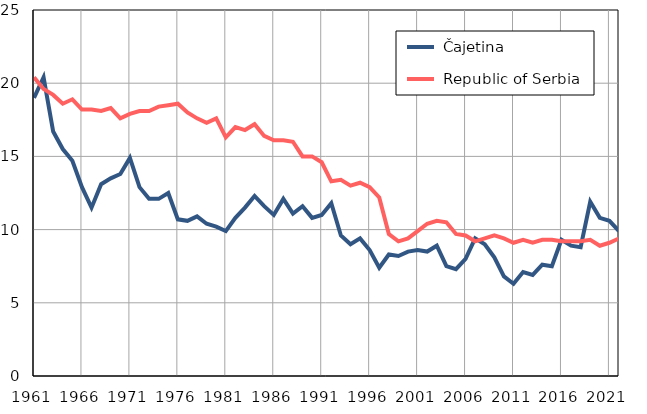
| Category |  Čajetina |  Republic of Serbia |
|---|---|---|
| 1961.0 | 19 | 20.4 |
| 1962.0 | 20.4 | 19.6 |
| 1963.0 | 16.7 | 19.2 |
| 1964.0 | 15.5 | 18.6 |
| 1965.0 | 14.7 | 18.9 |
| 1966.0 | 12.9 | 18.2 |
| 1967.0 | 11.5 | 18.2 |
| 1968.0 | 13.1 | 18.1 |
| 1969.0 | 13.5 | 18.3 |
| 1970.0 | 13.8 | 17.6 |
| 1971.0 | 14.9 | 17.9 |
| 1972.0 | 12.9 | 18.1 |
| 1973.0 | 12.1 | 18.1 |
| 1974.0 | 12.1 | 18.4 |
| 1975.0 | 12.5 | 18.5 |
| 1976.0 | 10.7 | 18.6 |
| 1977.0 | 10.6 | 18 |
| 1978.0 | 10.9 | 17.6 |
| 1979.0 | 10.4 | 17.3 |
| 1980.0 | 10.2 | 17.6 |
| 1981.0 | 9.9 | 16.3 |
| 1982.0 | 10.8 | 17 |
| 1983.0 | 11.5 | 16.8 |
| 1984.0 | 12.3 | 17.2 |
| 1985.0 | 11.6 | 16.4 |
| 1986.0 | 11 | 16.1 |
| 1987.0 | 12.1 | 16.1 |
| 1988.0 | 11.1 | 16 |
| 1989.0 | 11.6 | 15 |
| 1990.0 | 10.8 | 15 |
| 1991.0 | 11 | 14.6 |
| 1992.0 | 11.8 | 13.3 |
| 1993.0 | 9.6 | 13.4 |
| 1994.0 | 9 | 13 |
| 1995.0 | 9.4 | 13.2 |
| 1996.0 | 8.6 | 12.9 |
| 1997.0 | 7.4 | 12.2 |
| 1998.0 | 8.3 | 9.7 |
| 1999.0 | 8.2 | 9.2 |
| 2000.0 | 8.5 | 9.4 |
| 2001.0 | 8.6 | 9.9 |
| 2002.0 | 8.5 | 10.4 |
| 2003.0 | 8.9 | 10.6 |
| 2004.0 | 7.5 | 10.5 |
| 2005.0 | 7.3 | 9.7 |
| 2006.0 | 8 | 9.6 |
| 2007.0 | 9.4 | 9.2 |
| 2008.0 | 9 | 9.4 |
| 2009.0 | 8.1 | 9.6 |
| 2010.0 | 6.8 | 9.4 |
| 2011.0 | 6.3 | 9.1 |
| 2012.0 | 7.1 | 9.3 |
| 2013.0 | 6.9 | 9.1 |
| 2014.0 | 7.6 | 9.3 |
| 2015.0 | 7.5 | 9.3 |
| 2016.0 | 9.3 | 9.2 |
| 2017.0 | 8.9 | 9.2 |
| 2018.0 | 8.8 | 9.2 |
| 2019.0 | 11.9 | 9.3 |
| 2020.0 | 10.8 | 8.9 |
| 2021.0 | 10.6 | 9.1 |
| 2022.0 | 9.9 | 9.4 |